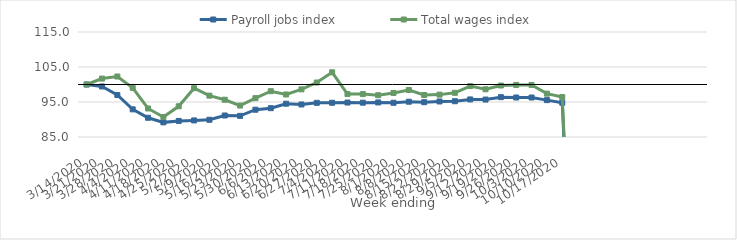
| Category | Payroll jobs index | Total wages index |
|---|---|---|
| 14/03/2020 | 100 | 100 |
| 21/03/2020 | 99.442 | 101.691 |
| 28/03/2020 | 96.993 | 102.286 |
| 04/04/2020 | 92.903 | 99.046 |
| 11/04/2020 | 90.497 | 93.152 |
| 18/04/2020 | 89.181 | 90.721 |
| 25/04/2020 | 89.59 | 93.774 |
| 02/05/2020 | 89.735 | 98.942 |
| 09/05/2020 | 89.924 | 96.818 |
| 16/05/2020 | 91.146 | 95.649 |
| 23/05/2020 | 91.038 | 93.981 |
| 30/05/2020 | 92.797 | 96.101 |
| 06/06/2020 | 93.235 | 98.086 |
| 13/06/2020 | 94.51 | 97.146 |
| 20/06/2020 | 94.293 | 98.609 |
| 27/06/2020 | 94.761 | 100.568 |
| 04/07/2020 | 94.783 | 103.494 |
| 11/07/2020 | 94.848 | 97.271 |
| 18/07/2020 | 94.806 | 97.252 |
| 25/07/2020 | 94.876 | 96.943 |
| 01/08/2020 | 94.778 | 97.586 |
| 08/08/2020 | 95.083 | 98.439 |
| 15/08/2020 | 94.942 | 96.999 |
| 22/08/2020 | 95.152 | 97.11 |
| 29/08/2020 | 95.219 | 97.628 |
| 05/09/2020 | 95.736 | 99.545 |
| 12/09/2020 | 95.697 | 98.636 |
| 19/09/2020 | 96.38 | 99.714 |
| 26/09/2020 | 96.28 | 99.877 |
| 03/10/2020 | 96.28 | 99.877 |
| 10/10/2020 | 95.534 | 97.385 |
| 17/10/2020 | 94.797 | 96.404 |